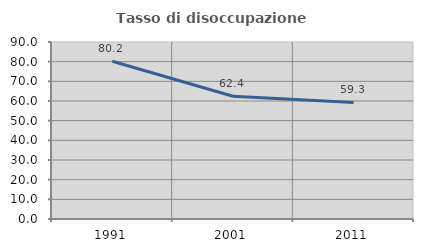
| Category | Tasso di disoccupazione giovanile  |
|---|---|
| 1991.0 | 80.189 |
| 2001.0 | 62.397 |
| 2011.0 | 59.276 |